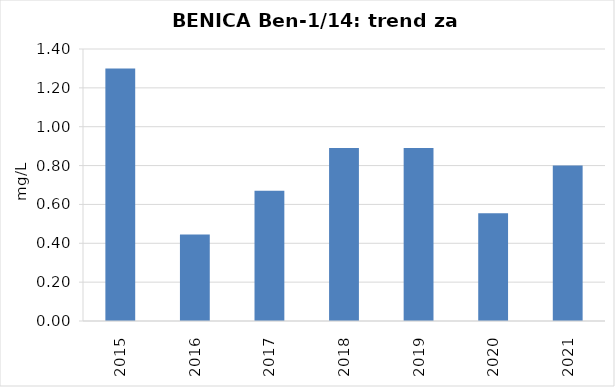
| Category | Vsota |
|---|---|
| 2015 | 1.3 |
| 2016 | 0.445 |
| 2017 | 0.67 |
| 2018 | 0.89 |
| 2019 | 0.89 |
| 2020 | 0.555 |
| 2021 | 0.8 |